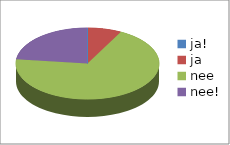
| Category | Series 0 | Series 1 |
|---|---|---|
| ja! | 0 | 0 |
| ja | 1 | 0.077 |
| nee | 9 | 0.692 |
| nee! | 3 | 0.231 |